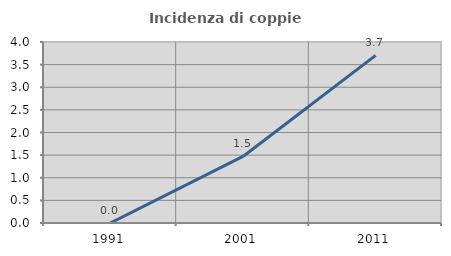
| Category | Incidenza di coppie miste |
|---|---|
| 1991.0 | 0 |
| 2001.0 | 1.471 |
| 2011.0 | 3.704 |